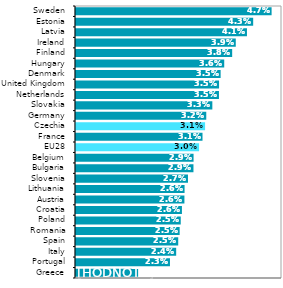
| Category | Series 0 |
|---|---|
| Greece | 0.015 |
| Portugal | 0.023 |
| Italy | 0.024 |
| Spain | 0.025 |
| Romania | 0.025 |
| Poland | 0.025 |
| Croatia | 0.026 |
| Austria | 0.026 |
| Lithuania | 0.026 |
| Slovenia | 0.027 |
| Bulgaria | 0.029 |
| Belgium | 0.029 |
| EU28 | 0.03 |
| France | 0.031 |
| Czechia | 0.031 |
| Germany | 0.032 |
| Slovakia | 0.033 |
| Netherlands | 0.035 |
| United Kingdom | 0.035 |
| Denmark | 0.035 |
| Hungary | 0.036 |
| Finland | 0.038 |
| Ireland | 0.039 |
| Latvia | 0.041 |
| Estonia | 0.043 |
| Sweden | 0.047 |